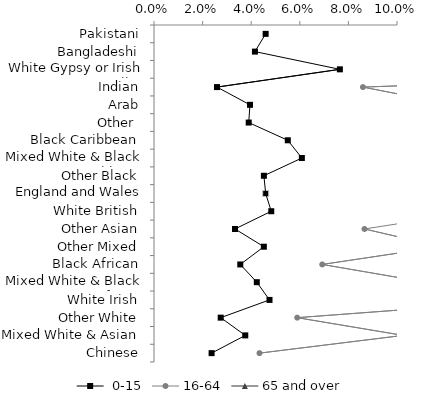
| Category | Series 0 |
|---|---|
| Pakistani | 0.046 |
| Bangladeshi | 0.042 |
| White Gypsy or Irish Traveller | 0.076 |
| Indian | 0.026 |
| Arab | 0.04 |
| Other  | 0.039 |
| Black Caribbean | 0.055 |
| Mixed White & Black Caribbean | 0.061 |
| Other Black | 0.045 |
| England and Wales Average | 0.046 |
| White British | 0.048 |
| Other Asian | 0.033 |
| Other Mixed | 0.045 |
| Black African | 0.036 |
| Mixed White & Black African | 0.042 |
| White Irish | 0.048 |
| Other White | 0.027 |
| Mixed White & Asian | 0.038 |
| Chinese | 0.024 |